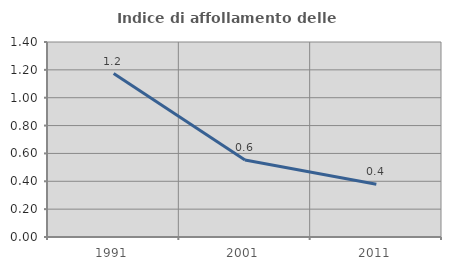
| Category | Indice di affollamento delle abitazioni  |
|---|---|
| 1991.0 | 1.173 |
| 2001.0 | 0.553 |
| 2011.0 | 0.378 |